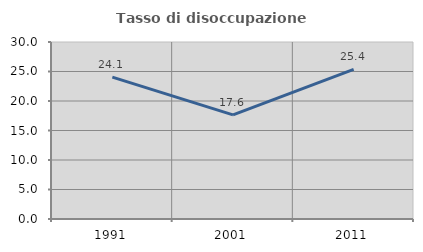
| Category | Tasso di disoccupazione giovanile  |
|---|---|
| 1991.0 | 24.051 |
| 2001.0 | 17.647 |
| 2011.0 | 25.373 |